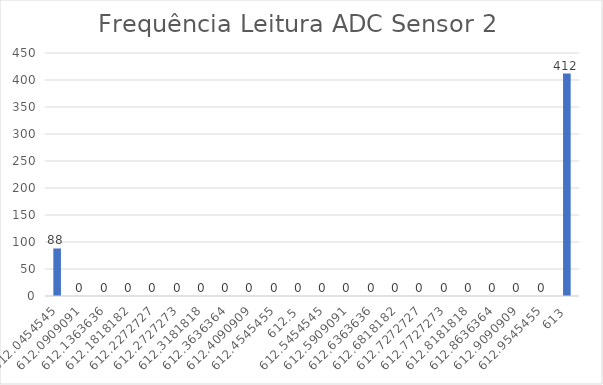
| Category | Series 0 |
|---|---|
| 612.0454545454545 | 88 |
| 612.0909090909091 | 0 |
| 612.1363636363636 | 0 |
| 612.1818181818181 | 0 |
| 612.2272727272727 | 0 |
| 612.2727272727273 | 0 |
| 612.3181818181819 | 0 |
| 612.3636363636364 | 0 |
| 612.4090909090909 | 0 |
| 612.4545454545455 | 0 |
| 612.5 | 0 |
| 612.5454545454545 | 0 |
| 612.5909090909091 | 0 |
| 612.6363636363636 | 0 |
| 612.6818181818181 | 0 |
| 612.7272727272727 | 0 |
| 612.7727272727273 | 0 |
| 612.8181818181819 | 0 |
| 612.8636363636364 | 0 |
| 612.9090909090909 | 0 |
| 612.9545454545455 | 0 |
| 613.0 | 412 |